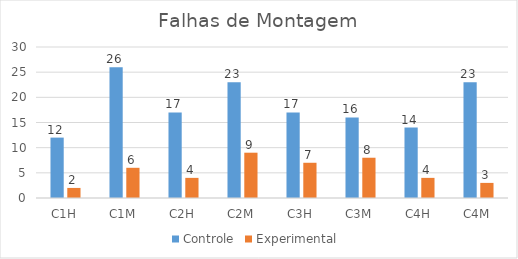
| Category | Controle | Experimental  |
|---|---|---|
| C1H | 12 | 2 |
| C1M | 26 | 6 |
| C2H | 17 | 4 |
| C2M | 23 | 9 |
| C3H | 17 | 7 |
| C3M | 16 | 8 |
| C4H | 14 | 4 |
| C4M | 23 | 3 |